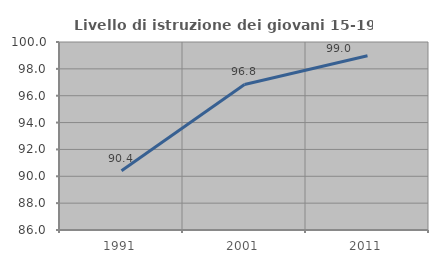
| Category | Livello di istruzione dei giovani 15-19 anni |
|---|---|
| 1991.0 | 90.419 |
| 2001.0 | 96.835 |
| 2011.0 | 98.979 |